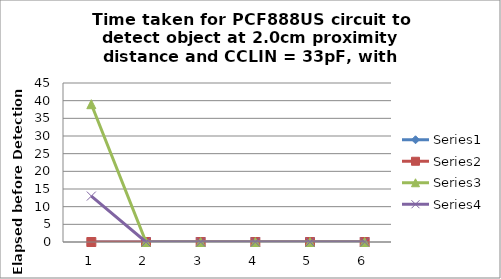
| Category | Series 0 | Series 1 | Series 2 | Series 3 |
|---|---|---|---|---|
| 0 | 0 | 0 | 39 | 13 |
| 1 | 0 | 0 | 0 | 0 |
| 2 | 0 | 0 | 0 | 0 |
| 3 | 0 | 0 | 0 | 0 |
| 4 | 0 | 0 | 0 | 0 |
| 5 | 0 | 0 | 0 | 0 |